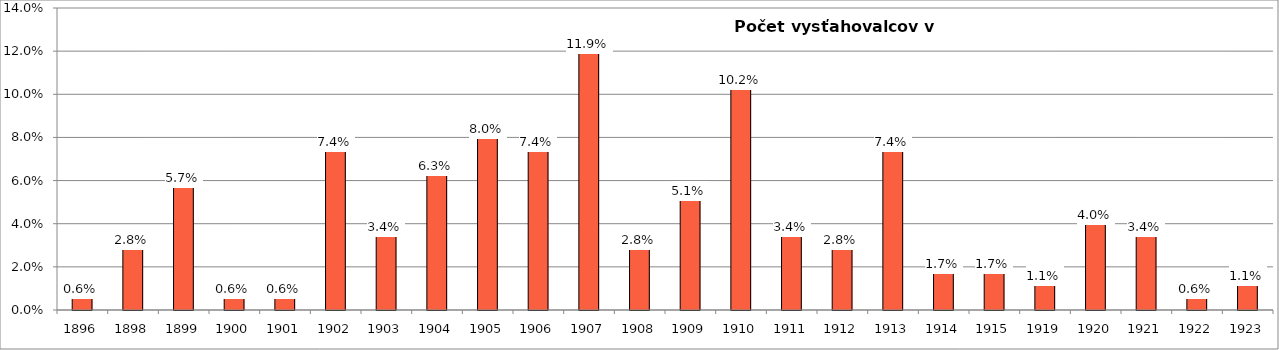
| Category | Počet vysťahovalcov v percentách |
|---|---|
| 1896.0 | 0.568 |
| 1898.0 | 2.841 |
| 1899.0 | 5.682 |
| 1900.0 | 0.568 |
| 1901.0 | 0.568 |
| 1902.0 | 7.386 |
| 1903.0 | 3.409 |
| 1904.0 | 6.25 |
| 1905.0 | 7.955 |
| 1906.0 | 7.386 |
| 1907.0 | 11.932 |
| 1908.0 | 2.841 |
| 1909.0 | 5.114 |
| 1910.0 | 10.227 |
| 1911.0 | 3.409 |
| 1912.0 | 2.841 |
| 1913.0 | 7.386 |
| 1914.0 | 1.705 |
| 1915.0 | 1.705 |
| 1919.0 | 1.136 |
| 1920.0 | 3.977 |
| 1921.0 | 3.409 |
| 1922.0 | 0.568 |
| 1923.0 | 1.136 |